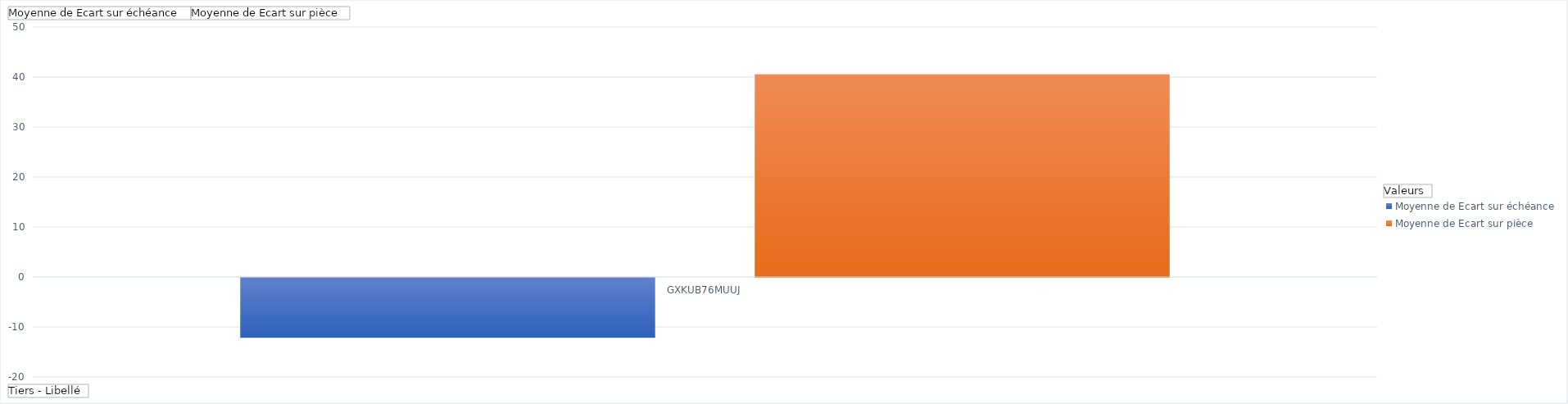
| Category | Moyenne de Ecart sur échéance | Moyenne de Ecart sur pièce |
|---|---|---|
| GXKUB76MUUJ | -12 | 40.545 |